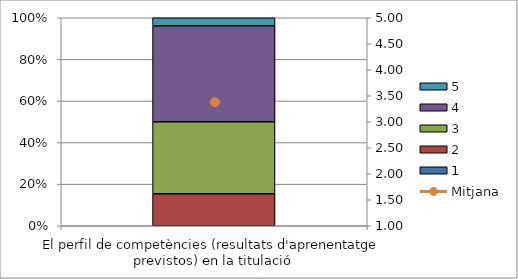
| Category | 1 | 2 | 3 | 4 | 5 |
|---|---|---|---|---|---|
| El perfil de competències (resultats d'aprenentatge previstos) en la titulació | 0 | 8 | 18 | 24 | 2 |